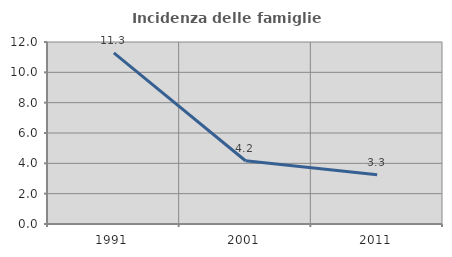
| Category | Incidenza delle famiglie numerose |
|---|---|
| 1991.0 | 11.284 |
| 2001.0 | 4.171 |
| 2011.0 | 3.252 |